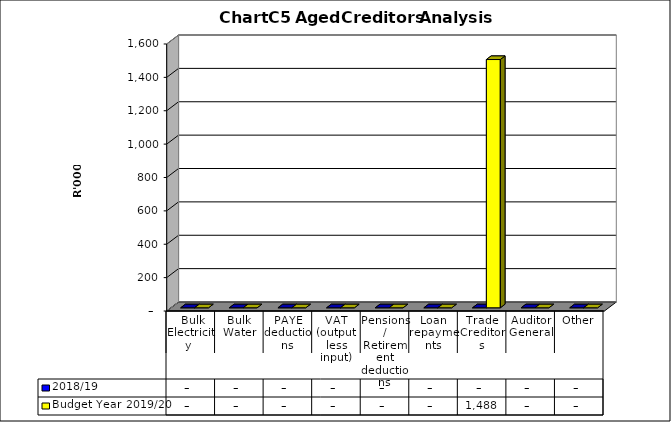
| Category | 2018/19 | Budget Year 2019/20 |
|---|---|---|
|  Bulk Electricity  | 0 | 0 |
| Bulk Water | 0 | 0 |
| PAYE deductions | 0 | 0 |
| VAT (output less input) | 0 | 0 |
| Pensions / Retirement deductions | 0 | 0 |
| Loan repayments | 0 | 0 |
| Trade Creditors | 0 | 1487720.78 |
| Auditor General | 0 | 0 |
| Other | 0 | 0 |